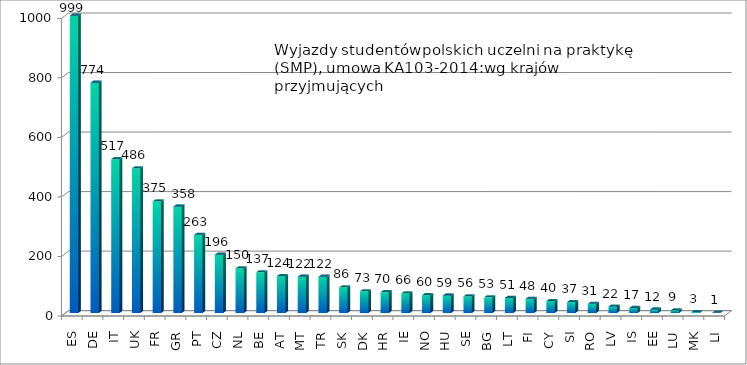
| Category | Series 0 |
|---|---|
| ES | 999 |
| DE | 774 |
| IT | 517 |
| UK | 486 |
| FR | 375 |
| GR | 358 |
| PT | 263 |
| CZ | 196 |
| NL | 150 |
| BE | 137 |
| AT | 124 |
| MT | 122 |
| TR | 122 |
| SK | 86 |
| DK | 73 |
| HR | 70 |
| IE | 66 |
| NO | 60 |
| HU | 59 |
| SE | 56 |
| BG | 53 |
| LT | 51 |
| FI | 48 |
| CY | 40 |
| SI | 37 |
| RO | 31 |
| LV | 22 |
| IS | 17 |
| EE | 12 |
| LU | 9 |
| MK | 3 |
| LI | 1 |